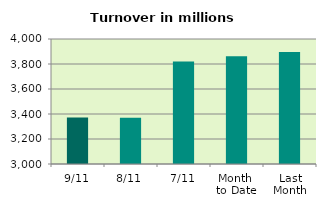
| Category | Series 0 |
|---|---|
| 9/11 | 3371.771 |
| 8/11 | 3370.379 |
| 7/11 | 3819.956 |
| Month 
to Date | 3862.211 |
| Last
Month | 3895.685 |